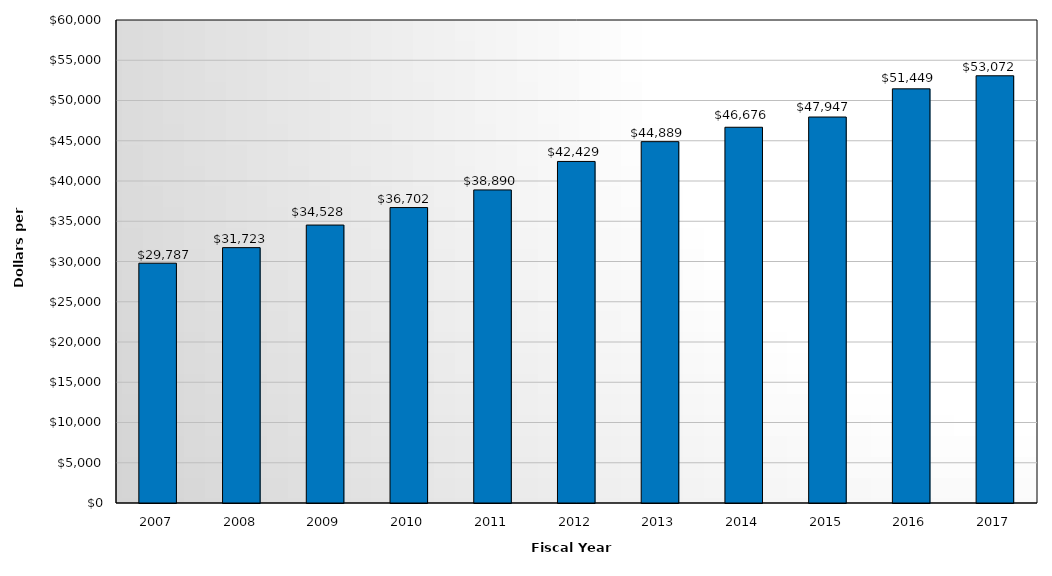
| Category | Tuition and Fees |
|---|---|
| 2007.0 | 29787 |
| 2008.0 | 31723 |
| 2009.0 | 34528 |
| 2010.0 | 36702 |
| 2011.0 | 38890 |
| 2012.0 | 42429 |
| 2013.0 | 44889 |
| 2014.0 | 46676 |
| 2015.0 | 47947 |
| 2016.0 | 51449 |
| 2017.0 | 53072 |